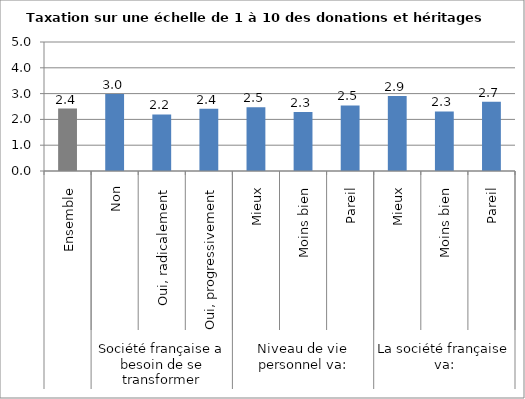
| Category | Les donations ou héritage |
|---|---|
| 0 | 2.42 |
| 1 | 2.98 |
| 2 | 2.19 |
| 3 | 2.41 |
| 4 | 2.47 |
| 5 | 2.29 |
| 6 | 2.54 |
| 7 | 2.91 |
| 8 | 2.31 |
| 9 | 2.68 |